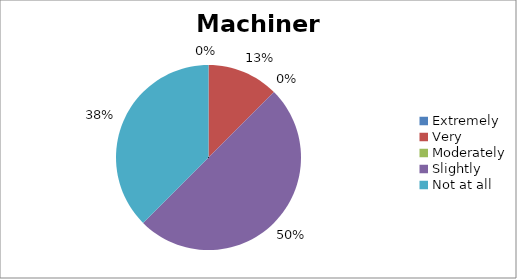
| Category | Machinery |
|---|---|
| Extremely | 0 |
| Very | 1 |
| Moderately | 0 |
| Slightly | 4 |
| Not at all | 3 |